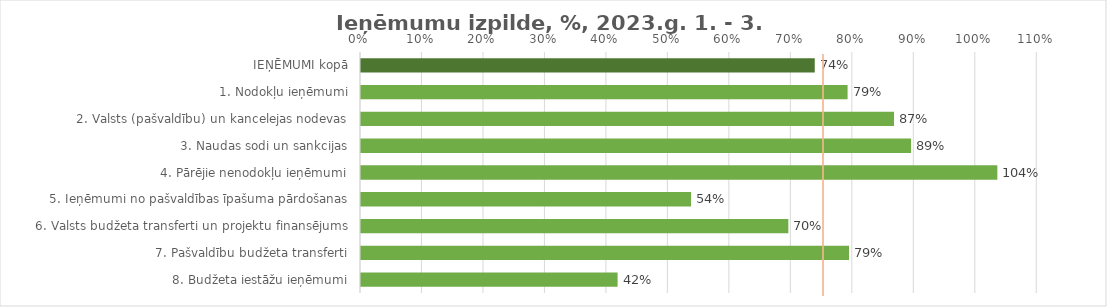
| Category | Ieņēmumu izpilde, %, 2023.g. 1. - 3. ceturksnis |
|---|---|
| IEŅĒMUMI kopā | 0.738 |
| 1. Nodokļu ieņēmumi | 0.791 |
| 2. Valsts (pašvaldību) un kancelejas nodevas | 0.867 |
| 3. Naudas sodi un sankcijas | 0.895 |
| 4. Pārējie nenodokļu ieņēmumi | 1.035 |
| 5. Ieņēmumi no pašvaldības īpašuma pārdošanas | 0.537 |
| 6. Valsts budžeta transferti un projektu finansējums | 0.695 |
| 7. Pašvaldību budžeta transferti | 0.794 |
| 8. Budžeta iestāžu ieņēmumi | 0.417 |